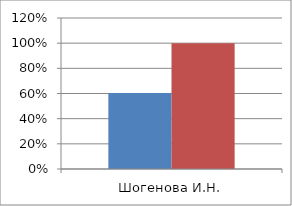
| Category | Series 0 | 2 |
|---|---|---|
| Шогенова И.Н. | 0.604 | 1 |